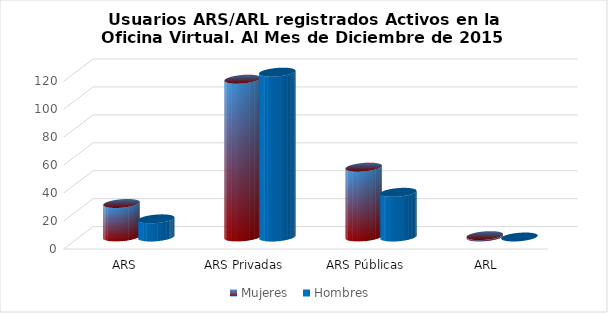
| Category | Mujeres | Hombres |
|---|---|---|
| ARS Autogestionadas | 24 | 13 |
| ARS Privadas | 113 | 118 |
| ARS Públicas | 50 | 32 |
| ARL | 1 | 0 |